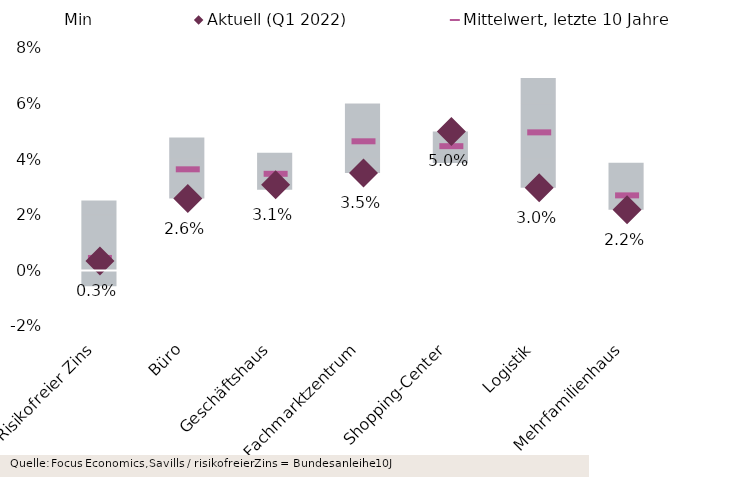
| Category | Min | Spanne Min/Max, letzte 10 Jahre |
|---|---|---|
| Risikofreier Zins | -0.006 | 0.025 |
| Büro | 0.026 | 0.022 |
| Geschäftshaus | 0.029 | 0.013 |
| Fachmarktzentrum | 0.035 | 0.025 |
| Shopping-Center | 0.039 | 0.011 |
| Logistik | 0.03 | 0.04 |
| Mehrfamilienhaus | 0.022 | 0.017 |